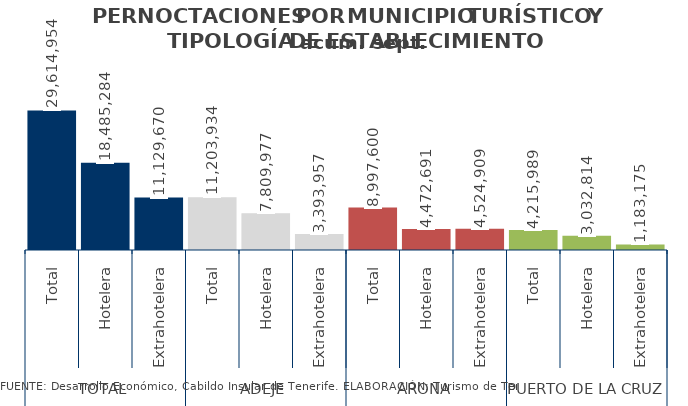
| Category | acum. sept. 2014 |
|---|---|
| 0 | 29614954 |
| 1 | 18485284 |
| 2 | 11129670 |
| 3 | 11203934 |
| 4 | 7809977 |
| 5 | 3393957 |
| 6 | 8997600 |
| 7 | 4472691 |
| 8 | 4524909 |
| 9 | 4215989 |
| 10 | 3032814 |
| 11 | 1183175 |